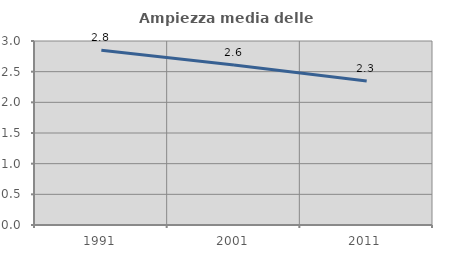
| Category | Ampiezza media delle famiglie |
|---|---|
| 1991.0 | 2.849 |
| 2001.0 | 2.609 |
| 2011.0 | 2.347 |